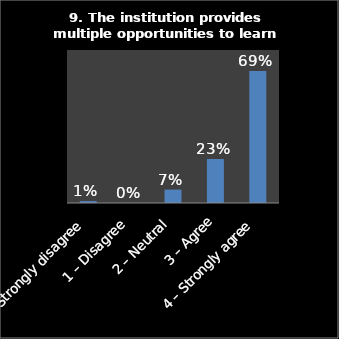
| Category | Series 0 |
|---|---|
| 0 – Strongly disagree | 0.01 |
| 1 – Disagree | 0 |
| 2 – Neutral | 0.07 |
| 3 – Agree | 0.23 |
| 4 – Strongly agree | 0.69 |